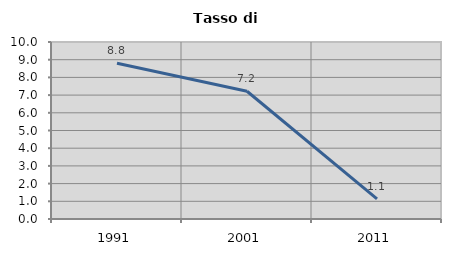
| Category | Tasso di disoccupazione   |
|---|---|
| 1991.0 | 8.8 |
| 2001.0 | 7.216 |
| 2011.0 | 1.136 |